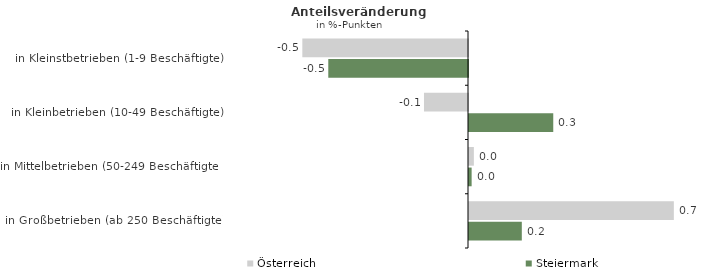
| Category | Österreich | Steiermark |
|---|---|---|
| in Kleinstbetrieben (1-9 Beschäftigte) | -0.55 | -0.464 |
| in Kleinbetrieben (10-49 Beschäftigte) | -0.146 | 0.28 |
| in Mittelbetrieben (50-249 Beschäftigte) | 0.016 | 0.009 |
| in Großbetrieben (ab 250 Beschäftigte) | 0.68 | 0.175 |